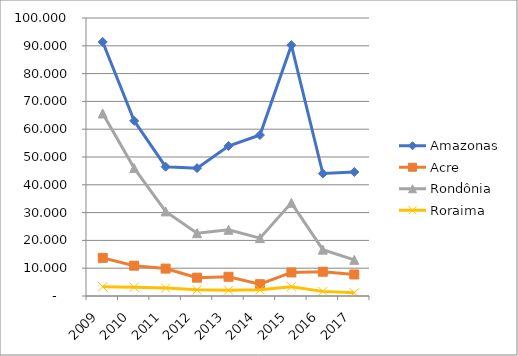
| Category | Amazonas | Acre | Rondônia | Roraima |
|---|---|---|---|---|
| 2009.0 | 91.376 | 13.72 | 65.647 | 3.338 |
| 2010.0 | 62.993 | 10.899 | 46.01 | 3.164 |
| 2011.0 | 46.511 | 9.854 | 30.431 | 2.855 |
| 2012.0 | 45.997 | 6.595 | 22.61 | 2.214 |
| 2013.0 | 53.965 | 6.916 | 23.817 | 2.092 |
| 2014.0 | 57.9 | 4.246 | 20.818 | 2.243 |
| 2015.0 | 90.228 | 8.477 | 33.513 | 3.332 |
| 2016.0 | 44.047 | 8.728 | 16.678 | 1.663 |
| 2017.0 | 44.607 | 7.747 | 13.008 | 1.167 |